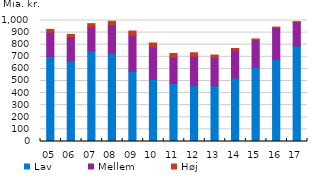
| Category | Lav | Mellem | Høj |
|---|---|---|---|
| 05 | 702.218 | 201.899 | 22.671 |
| 06 | 664.758 | 202.314 | 18.156 |
| 07 | 749.075 | 197.246 | 27.552 |
| 08 | 730.076 | 235.584 | 27.795 |
| 09 | 578.229 | 301.442 | 33.229 |
| 10 | 512.987 | 268.188 | 32.919 |
| 11 | 482.313 | 215.272 | 29.989 |
| 12 | 462.976 | 241.817 | 28.516 |
| 13 | 460.859 | 234.134 | 19.665 |
| 14 | 524.889 | 230.669 | 13.155 |
| 15 | 613.708 | 226.534 | 7.132 |
| 16 | 677.221 | 264.137 | 4.153 |
| 17 | 788.81 | 196.936 | 5.26 |